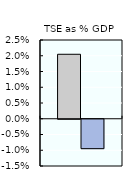
| Category | 2000-02 | 2016-18 |
|---|---|---|
| TSE as % GDP | 0.02 | -0.009 |